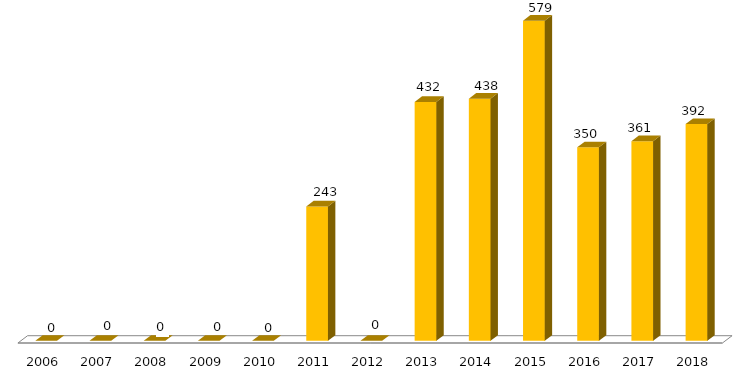
| Category | Andamento* |
|---|---|
| 2006.0 | 0 |
| 2007.0 | 0 |
| 2008.0 | 0 |
| 2009.0 | 0 |
| 2010.0 | 0 |
| 2011.0 | 243 |
| 2012.0 | 0 |
| 2013.0 | 432 |
| 2014.0 | 438 |
| 2015.0 | 579 |
| 2016.0 | 350 |
| 2017.0 | 361 |
| 2018.0 | 392 |